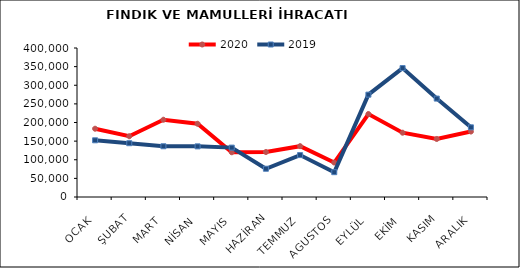
| Category | 2020 | 2019 |
|---|---|---|
| OCAK | 183299.509 | 152194.744 |
| ŞUBAT | 163093.919 | 144402.651 |
| MART | 207436.285 | 136203.454 |
| NİSAN | 196618.325 | 135925.362 |
| MAYIS | 120083.221 | 132553.25 |
| HAZİRAN | 120708.792 | 75849.333 |
| TEMMUZ | 136481.303 | 112534.877 |
| AGUSTOS | 92430.685 | 66613.028 |
| EYLÜL | 222691.33 | 274784.348 |
| EKİM | 172597.175 | 346124.53 |
| KASIM | 155821.799 | 264184.229 |
| ARALIK | 175726.567 | 187014.76 |